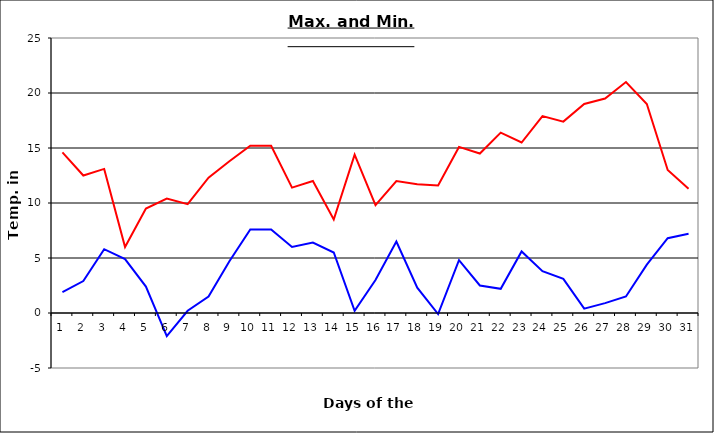
| Category | Series 0 | Series 1 |
|---|---|---|
| 0 | 14.6 | 1.9 |
| 1 | 12.5 | 2.9 |
| 2 | 13.1 | 5.8 |
| 3 | 6 | 4.9 |
| 4 | 9.5 | 2.4 |
| 5 | 10.4 | -2.1 |
| 6 | 9.9 | 0.2 |
| 7 | 12.3 | 1.5 |
| 8 | 13.8 | 4.7 |
| 9 | 15.2 | 7.6 |
| 10 | 15.2 | 7.6 |
| 11 | 11.4 | 6 |
| 12 | 12 | 6.4 |
| 13 | 8.5 | 5.5 |
| 14 | 14.4 | 0.2 |
| 15 | 9.8 | 3 |
| 16 | 12 | 6.5 |
| 17 | 11.7 | 2.3 |
| 18 | 11.6 | -0.1 |
| 19 | 15.1 | 4.8 |
| 20 | 14.5 | 2.5 |
| 21 | 16.4 | 2.2 |
| 22 | 15.5 | 5.6 |
| 23 | 17.9 | 3.8 |
| 24 | 17.4 | 3.1 |
| 25 | 19 | 0.4 |
| 26 | 19.5 | 0.9 |
| 27 | 21 | 1.5 |
| 28 | 19 | 4.4 |
| 29 | 13 | 6.8 |
| 30 | 11.3 | 7.2 |